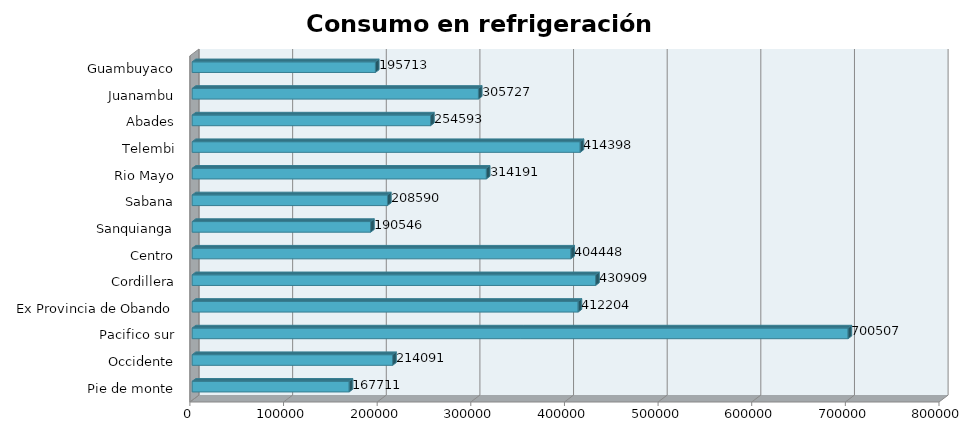
| Category | Series 0 |
|---|---|
| Pie de monte | 167711.003 |
| Occidente | 214091.101 |
| Pacifico sur | 700506.558 |
| Ex Provincia de Obando | 412204.184 |
| Cordillera | 430909.307 |
| Centro | 404448.47 |
| Sanquianga | 190546.276 |
| Sabana | 208590.234 |
| Rio Mayo | 314190.948 |
| Telembi | 414398.379 |
| Abades | 254593.024 |
| Juanambu | 305726.595 |
| Guambuyaco | 195713.462 |